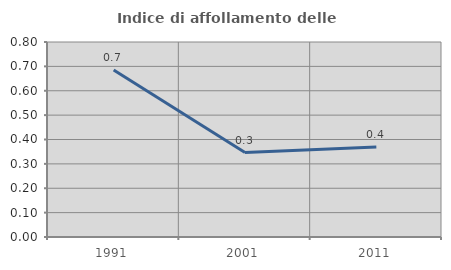
| Category | Indice di affollamento delle abitazioni  |
|---|---|
| 1991.0 | 0.685 |
| 2001.0 | 0.346 |
| 2011.0 | 0.37 |